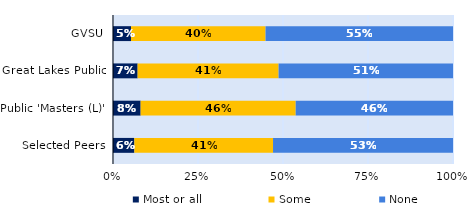
| Category | Most or all | Some | None |
|---|---|---|---|
| GVSU | 0.053 | 0.396 | 0.551 |
| Great Lakes Public | 0.072 | 0.415 | 0.513 |
| Public 'Masters (L)' | 0.081 | 0.456 | 0.463 |
| Selected Peers | 0.063 | 0.408 | 0.529 |